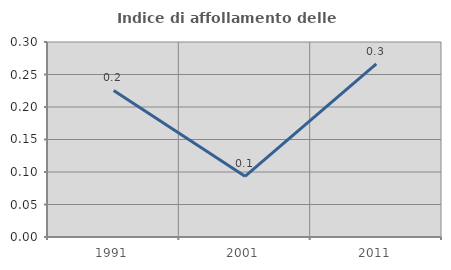
| Category | Indice di affollamento delle abitazioni  |
|---|---|
| 1991.0 | 0.225 |
| 2001.0 | 0.093 |
| 2011.0 | 0.266 |